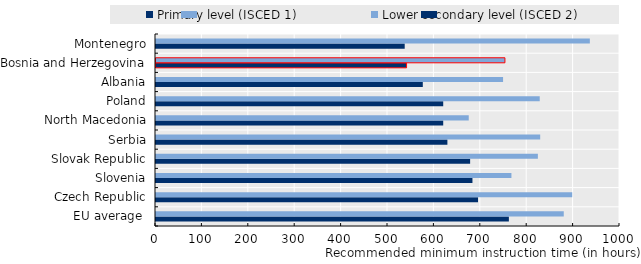
| Category | Primary level (ISCED 1) | Lower secondary level (ISCED 2) |
|---|---|---|
| EU average  | 760.5 | 878.786 |
| Czech Republic | 694 | 897 |
| Slovenia | 682 | 766 |
| Slovak Republic | 677 | 823 |
| Serbia | 628 | 828 |
| North Macedonia | 619 | 674 |
| Poland | 619 | 827 |
| Albania | 575 | 748 |
| Bosnia and Herzegovina | 540 | 752 |
| Montenegro | 536 | 935 |